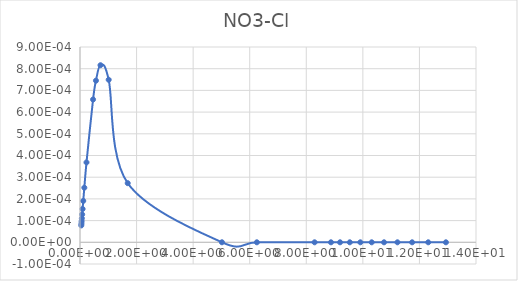
| Category | Series 0 |
|---|---|
| 0.045799 | 0 |
| 0.050887 | 0 |
| 0.057259 | 0 |
| 0.065457 | 0 |
| 0.076371 | 0 |
| 0.091686 | 0 |
| 0.11463 | 0 |
| 0.15299 | 0 |
| 0.22971 | 0 |
| 0.46165 | 0.001 |
| 0.56409 | 0.001 |
| 0.72494 | 0.001 |
| 1.0141 | 0.001 |
| 1.6871 | 0 |
| 5.0184 | 0 |
| 6.2531 | 0 |
| 8.2936 | 0 |
| 8.8726 | 0 |
| 9.1936 | 0 |
| 9.5386 | 0 |
| 9.9106 | 0 |
| 10.313 | 0 |
| 10.749 | 0 |
| 11.223 | 0 |
| 11.742 | 0 |
| 12.311 | 0 |
| 12.937 | 0 |